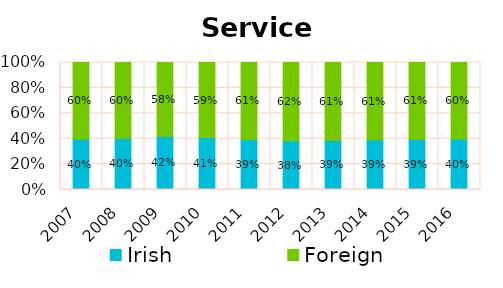
| Category | Irish | Foreign |
|---|---|---|
| 2007.0 | 0.396 | 0.604 |
| 2008.0 | 0.402 | 0.598 |
| 2009.0 | 0.418 | 0.582 |
| 2010.0 | 0.409 | 0.591 |
| 2011.0 | 0.394 | 0.606 |
| 2012.0 | 0.384 | 0.616 |
| 2013.0 | 0.387 | 0.613 |
| 2014.0 | 0.392 | 0.608 |
| 2015.0 | 0.394 | 0.606 |
| 2016.0 | 0.398 | 0.602 |